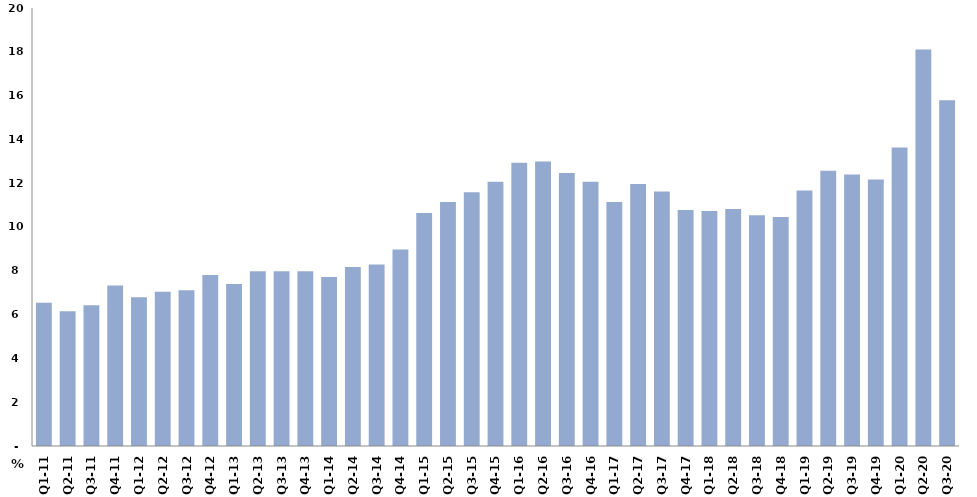
| Category | النسبة المئوية من الناتج المحلي الاجمالي
Percent of Total GDP |
|---|---|
| Q1-11 | 6.543 |
| Q2-11 | 6.156 |
| Q3-11 | 6.425 |
| Q4-11 | 7.326 |
| Q1-12 | 6.787 |
| Q2-12 | 7.044 |
| Q3-12 | 7.11 |
| Q4-12 | 7.804 |
| Q1-13 | 7.399 |
| Q2-13 | 7.977 |
| Q3-13 | 7.977 |
| Q4-13 | 7.982 |
| Q1-14 | 7.718 |
| Q2-14 | 8.174 |
| Q3-14 | 8.293 |
| Q4-14 | 8.971 |
| Q1-15 | 10.645 |
| Q2-15 | 11.137 |
| Q3-15 | 11.584 |
| Q4-15 | 12.067 |
| Q1-16 | 12.935 |
| Q2-16 | 12.985 |
| Q3-16 | 12.471 |
| Q4-16 | 12.065 |
| Q1-17 | 11.138 |
| Q2-17 | 11.963 |
| Q3-17 | 11.618 |
| Q4-17 | 10.771 |
| Q1-18 | 10.727 |
| Q2-18 | 10.824 |
| Q3-18 | 10.533 |
| Q4-18 | 10.456 |
| Q1-19 | 11.667 |
| Q2-19 | 12.563 |
| Q3-19 | 12.401 |
| Q4-19 | 12.167 |
| Q1-20 | 13.636 |
| Q2-20 | 18.1 |
| Q3-20 | 15.788 |